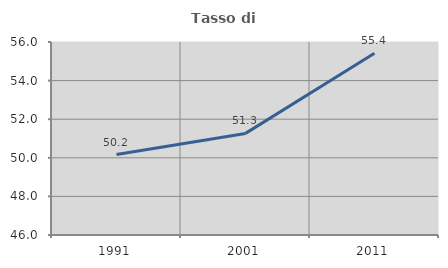
| Category | Tasso di occupazione   |
|---|---|
| 1991.0 | 50.168 |
| 2001.0 | 51.264 |
| 2011.0 | 55.42 |